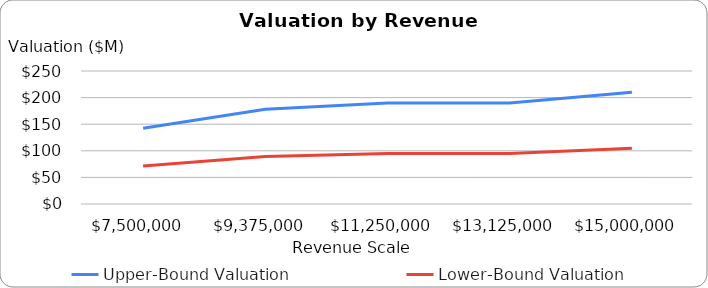
| Category | Upper-Bound Valuation | Lower-Bound Valuation |
|---|---|---|
| 7500000.0 | 142.5 | 71.25 |
| 9375000.0 | 178.125 | 89.062 |
| 11250000.0 | 190 | 95 |
| 13125000.0 | 190 | 95 |
| 15000000.0 | 210 | 105 |